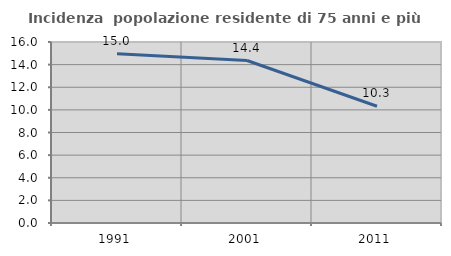
| Category | Incidenza  popolazione residente di 75 anni e più |
|---|---|
| 1991.0 | 14.961 |
| 2001.0 | 14.362 |
| 2011.0 | 10.317 |